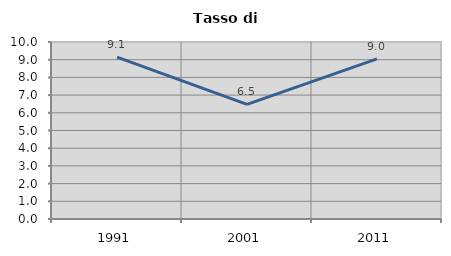
| Category | Tasso di disoccupazione   |
|---|---|
| 1991.0 | 9.143 |
| 2001.0 | 6.479 |
| 2011.0 | 9.044 |